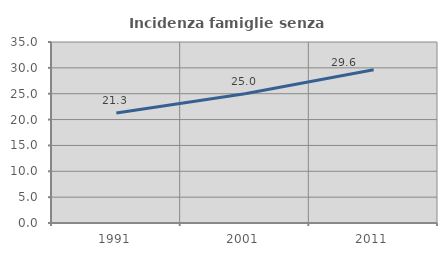
| Category | Incidenza famiglie senza nuclei |
|---|---|
| 1991.0 | 21.291 |
| 2001.0 | 25 |
| 2011.0 | 29.616 |